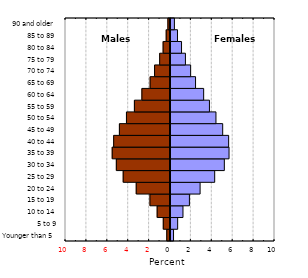
| Category | Series 0 |
|---|---|
| Younger than 5 | 0.29 |
| 5 to 9 | 0.685 |
| 10 to 14 | 1.194 |
| 15 to 19 | 1.81 |
| 20 to 24 | 2.833 |
| 25 to 29 | 4.229 |
| 30 to 34 | 5.152 |
| 35 to 39 | 5.602 |
| 40 to 44 | 5.564 |
| 45 to 49 | 4.995 |
| 50 to 54 | 4.35 |
| 55 to 59 | 3.727 |
| 60 to 64 | 3.174 |
| 65 to 69 | 2.397 |
| 70 to 74 | 1.928 |
| 75 to 79 | 1.429 |
| 80 to 84 | 1.056 |
| 85 to 89 | 0.67 |
| 90 and older | 0.373 |